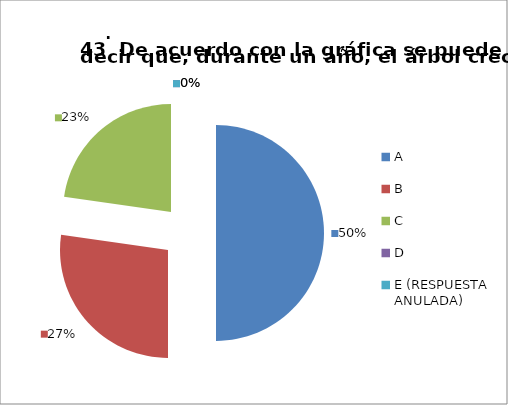
| Category | CANTIDAD DE RESPUESTAS PREGUNTA (43) | PORCENTAJE |
|---|---|---|
| A | 11 | 0.5 |
| B | 6 | 0.273 |
| C | 5 | 0.227 |
| D | 0 | 0 |
| E (RESPUESTA ANULADA) | 0 | 0 |